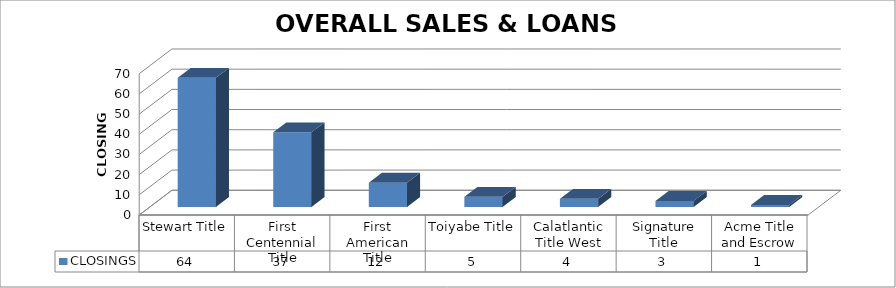
| Category | CLOSINGS |
|---|---|
| Stewart Title | 64 |
| First Centennial Title | 37 |
| First American Title | 12 |
| Toiyabe Title | 5 |
| Calatlantic Title West | 4 |
| Signature Title | 3 |
| Acme Title and Escrow | 1 |